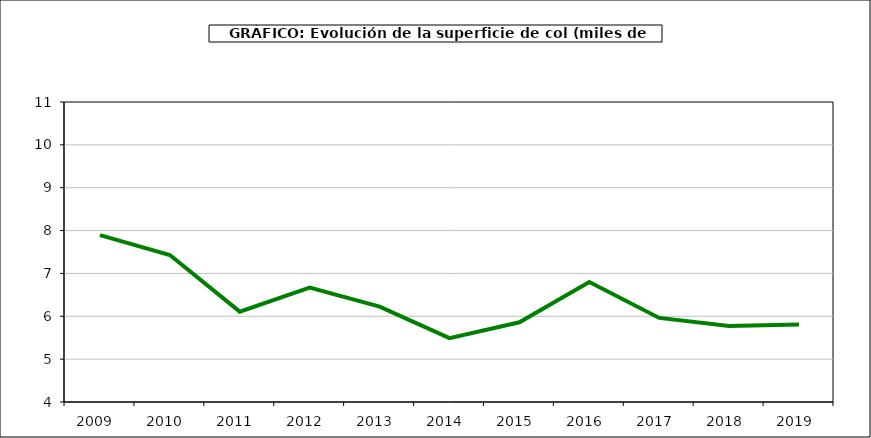
| Category | superficie |
|---|---|
| 2009.0 | 7.895 |
| 2010.0 | 7.43 |
| 2011.0 | 6.108 |
| 2012.0 | 6.669 |
| 2013.0 | 6.224 |
| 2014.0 | 5.489 |
| 2015.0 | 5.861 |
| 2016.0 | 6.799 |
| 2017.0 | 5.962 |
| 2018.0 | 5.774 |
| 2019.0 | 5.806 |